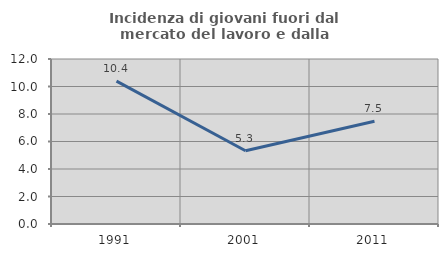
| Category | Incidenza di giovani fuori dal mercato del lavoro e dalla formazione  |
|---|---|
| 1991.0 | 10.395 |
| 2001.0 | 5.324 |
| 2011.0 | 7.475 |